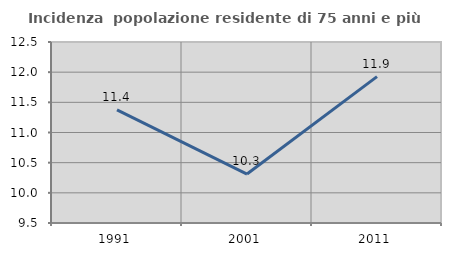
| Category | Incidenza  popolazione residente di 75 anni e più |
|---|---|
| 1991.0 | 11.377 |
| 2001.0 | 10.311 |
| 2011.0 | 11.926 |